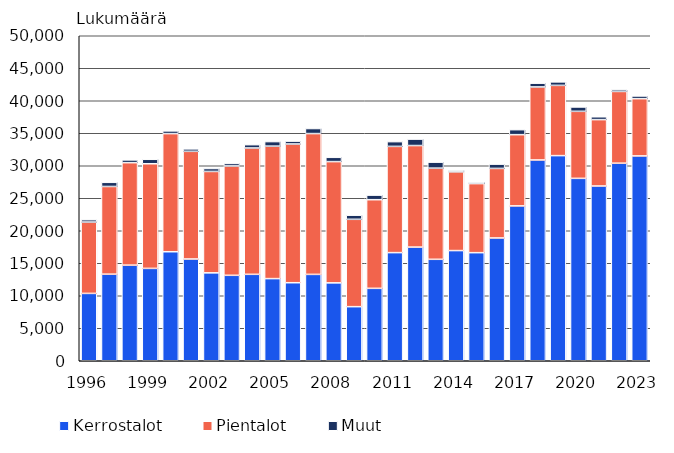
| Category | Kerrostalot | Pientalot | Muut |
|---|---|---|---|
| 1996.0 | 10361 | 10976 | 366 |
| 1997.0 | 13318 | 13493 | 640 |
| 1998.0 | 14708 | 15767 | 425 |
| 1999.0 | 14211 | 16099 | 685 |
| 2000.0 | 16772 | 18173 | 420 |
| 2001.0 | 15655 | 16565 | 378 |
| 2002.0 | 13523 | 15602 | 454 |
| 2003.0 | 13146 | 16822 | 391 |
| 2004.0 | 13296 | 19435 | 513 |
| 2005.0 | 12639 | 20379 | 700 |
| 2006.0 | 12007 | 21340 | 445 |
| 2007.0 | 13287 | 21663 | 776 |
| 2008.0 | 11981 | 18657 | 658 |
| 2009.0 | 8320 | 13442 | 631 |
| 2010.0 | 11140 | 13638 | 704 |
| 2011.0 | 16635 | 16344 | 732 |
| 2012.0 | 17486 | 15623 | 990 |
| 2013.0 | 15607 | 14026 | 920 |
| 2014.0 | 16951 | 12109 | 263 |
| 2015.0 | 16628 | 10625 | 226 |
| 2016.0 | 18890 | 10700 | 660 |
| 2017.0 | 23825 | 10958 | 769 |
| 2018.0 | 30893 | 11232 | 579 |
| 2019.0 | 31559 | 10807 | 537 |
| 2020.0 | 28062 | 10313 | 667 |
| 2021.0 | 26887 | 10211 | 437 |
| 2022.0 | 30392 | 11041 | 277 |
| 2023.0 | 31513 | 8807 | 417 |